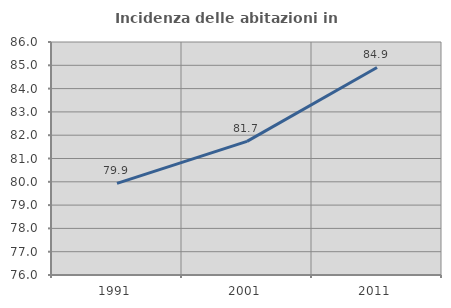
| Category | Incidenza delle abitazioni in proprietà  |
|---|---|
| 1991.0 | 79.935 |
| 2001.0 | 81.734 |
| 2011.0 | 84.906 |